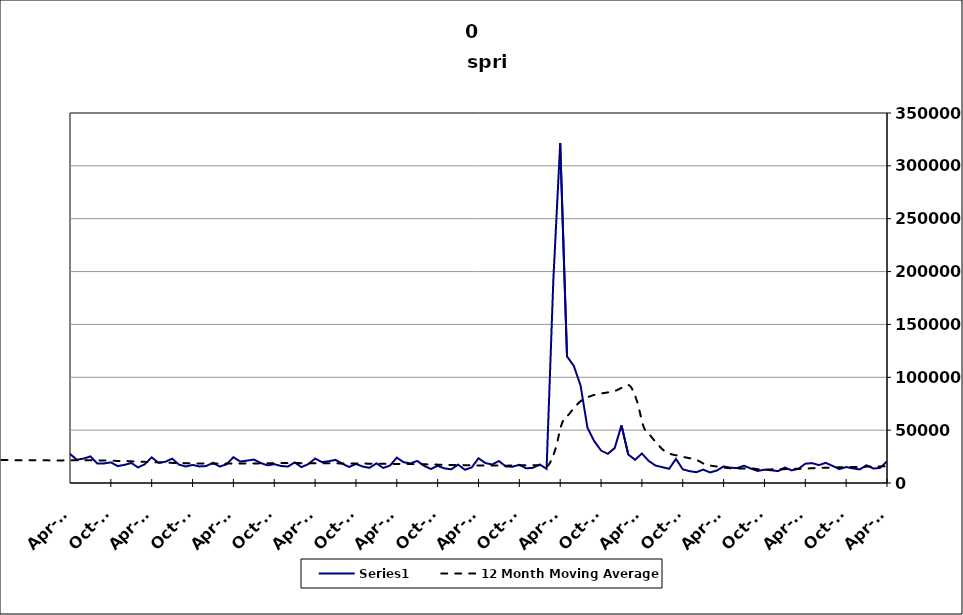
| Category | Series 0 |
|---|---|
| 2005-06-30 | 15559 |
| 2005-07-31 | 18863 |
| 2005-08-31 | 13688 |
| 2005-09-30 | 11216 |
| 2005-10-31 | 15195 |
| 2005-11-30 | 11106 |
| 2005-12-31 | 12178 |
| 2006-01-31 | 12307 |
| 2006-02-28 | 9756 |
| 2006-03-31 | 11166 |
| 2006-04-30 | 18194 |
| 2006-05-31 | 13863 |
| 2006-06-30 | 14337 |
| 2006-07-31 | 17845 |
| 2006-08-31 | 13259 |
| 2006-09-30 | 13170 |
| 2006-10-31 | 14318 |
| 2006-11-30 | 12528 |
| 2006-12-31 | 14662 |
| 2007-01-31 | 14365 |
| 2007-02-28 | 12004 |
| 2007-03-31 | 15715 |
| 2007-04-30 | 21487 |
| 2007-05-31 | 15927 |
| 2007-06-30 | 20117 |
| 2007-07-30 | 19634 |
| 2007-08-31 | 15908 |
| 2007-09-30 | 17289 |
| 2007-10-31 | 17016 |
| 2007-11-15 | 14868 |
| 2007-12-15 09:36:00 | 15051 |
| 2008-01-14 19:12:00 | 19519 |
| 2008-02-14 04:48:00 | 17071 |
| 2008-03-15 14:24:00 | 18041 |
| 2008-04-15 | 26337 |
| 2008-05-15 09:36:00 | 21529 |
| 2008-06-14 19:12:00 | 24509 |
| 2008-07-15 04:48:00 | 26739 |
| 2008-08-14 14:24:00 | 22508 |
| 2008-09-14 | 24197 |
| 2008-10-14 09:36:00 | 30666 |
| 2008-11-13 19:12:00 | 30363 |
| 2008-12-14 04:48:00 | 34409 |
| 2009-01-13 14:24:00 | 39076 |
| 2009-02-13 | 34958 |
| 2009-03-15 09:36:00 | 39174 |
| 2009-04-14 19:12:00 | 41068 |
| 2009-05-15 04:48:00 | 34839 |
| 2009-06-14 14:24:00 | 38758 |
| 2009-07-15 | 38827 |
| 2009-08-14 09:36:00 | 32747 |
| 2009-09-13 19:12:00 | 30654 |
| 2009-10-14 04:48:00 | 31279 |
| 2009-11-13 14:24:00 | 28764 |
| 2009-12-14 | 28567 |
| 2010-01-13 09:36:00 | 31536 |
| 2010-02-12 19:12:00 | 23411 |
| 2010-03-15 04:48:00 | 27064 |
| 2010-04-14 14:24:00 | 31806 |
| 2010-05-15 | 27535 |
| 2010-06-14 09:36:00 | 30999 |
| 2010-07-14 19:12:00 | 30859 |
| 2010-08-14 04:48:00 | 27473 |
| 2010-09-13 14:24:00 | 23569 |
| 2010-10-14 | 26397 |
| 2010-11-13 09:36:00 | 23332 |
| 2010-12-13 19:12:00 | 23208 |
| 2011-01-13 04:48:00 | 29123 |
| 2011-02-12 14:24:00 | 19880 |
| 2011-03-15 | 23037 |
| 2011-04-14 09:36:00 | 29838 |
| 2011-05-14 19:12:00 | 26805 |
| 2011-06-14 04:48:00 | 27951 |
| 2011-07-14 14:24:00 | 27959 |
| 2011-08-14 | 25368 |
| 2011-09-13 09:36:00 | 21516 |
| 2011-10-13 19:12:00 | 25249 |
| 2011-11-13 04:48:00 | 21348 |
| 2011-12-13 14:24:00 | 21373 |
| 2012-01-13 | 26870 |
| 2012-02-12 09:36:00 | 19799 |
| 2012-03-13 19:12:00 | 20523 |
| 2012-04-13 04:48:00 | 29208 |
| 2012-05-13 14:24:00 | 25322 |
| 2012-06-13 | 23562 |
| 2012-07-13 09:36:00 | 27564 |
| 2012-08-12 19:12:00 | 21787 |
| 2012-09-12 04:48:00 | 18024 |
| 2012-10-12 14:24:00 | 22967 |
| 2012-11-12 | 19147 |
| 2012-12-12 09:36:00 | 18332 |
| 2013-01-11 19:12:00 | 24929 |
| 2013-02-11 04:48:00 | 17864 |
| 2013-03-13 14:24:00 | 18518 |
| 2013-04-13 | 27564 |
| 2013-05-13 09:36:00 | 22544 |
| 2013-06-12 19:12:00 | 22178 |
| 2013-07-13 04:48:00 | 25052 |
| 2013-08-12 14:24:00 | 20510 |
| 2013-09-12 | 18652 |
| 2013-10-12 09:36:00 | 23457 |
| 2013-11-11 19:12:00 | 17762 |
| 2013-12-12 04:48:00 | 18554 |
| 2014-01-11 14:24:00 | 23110 |
| 2014-02-11 | 17656 |
| 2014-03-13 09:36:00 | 20574 |
| 2014-04-12 19:12:00 | 27528 |
| 2014-05-13 04:48:00 | 22003 |
| 2014-06-12 14:24:00 | 23093 |
| 2014-07-13 | 25159 |
| 2014-08-12 09:36:00 | 18501 |
| 2014-09-11 19:12:00 | 18519 |
| 2014-10-12 04:48:00 | 19501 |
| 2014-11-11 14:24:00 | 16036 |
| 2014-12-12 | 17142 |
| 2015-01-11 09:36:00 | 18920 |
| 2015-02-10 19:12:00 | 14673 |
| 2015-03-13 04:48:00 | 17842 |
| 2015-04-12 14:24:00 | 24284 |
| 2015-05-13 | 19120 |
| 2015-06-12 09:36:00 | 20073 |
| 2015-07-12 19:12:00 | 23007 |
| 2015-08-12 04:48:00 | 17420 |
| 2015-09-11 14:24:00 | 15620 |
| 2015-10-12 | 17117 |
| 2015-11-11 09:36:00 | 15685 |
| 2015-12-11 19:12:00 | 16020 |
| 2016-01-11 04:48:00 | 19143 |
| 2016-02-10 14:24:00 | 15551 |
| 2016-03-12 | 17721 |
| 2016-04-11 09:36:00 | 24381 |
| 2016-05-11 19:12:00 | 20319 |
| 2016-06-11 04:48:00 | 21157 |
| 2016-07-11 14:24:00 | 22155 |
| 2016-08-11 | 18945 |
| 2016-09-10 09:36:00 | 16699 |
| 2016-10-10 19:12:00 | 17773 |
| 2016-11-10 04:48:00 | 16104 |
| 2016-12-10 14:24:00 | 15555 |
| 2017-01-10 | 19468 |
| 2017-02-09 09:36:00 | 15031 |
| 2017-03-11 19:12:00 | 17840 |
| 2017-04-11 04:48:00 | 23124 |
| 2017-05-11 14:24:00 | 19802 |
| 2017-06-11 | 20588 |
| 2017-07-11 09:36:00 | 21858 |
| 2017-08-10 19:12:00 | 18231 |
| 2017-09-10 04:48:00 | 15171 |
| 2017-10-10 14:24:00 | 18027 |
| 2017-11-10 | 15538 |
| 2017-12-10 09:36:00 | 14339 |
| 2018-01-09 19:12:00 | 18538 |
| 2018-02-09 04:48:00 | 14230 |
| 2018-03-11 14:24:00 | 16525 |
| 2018-04-11 | 23962 |
| 2018-05-11 09:36:00 | 19679 |
| 2018-06-10 19:12:00 | 18492 |
| 2018-07-11 04:48:00 | 20879 |
| 2018-08-10 14:24:00 | 16306 |
| 2018-09-10 | 13227 |
| 2018-10-10 09:36:00 | 16273 |
| 2018-11-09 19:12:00 | 13796 |
| 2018-12-10 04:48:00 | 12964 |
| 2019-01-09 14:24:00 | 17391 |
| 2019-02-09 | 12534 |
| 2019-03-11 09:36:00 | 14705 |
| 2019-04-10 19:12:00 | 23399 |
| 2019-05-11 04:48:00 | 18895 |
| 2019-06-10 14:24:00 | 17486 |
| 2019-07-11 | 20792 |
| 2019-08-10 09:36:00 | 15676 |
| 2019-09-09 19:12:00 | 15415 |
| 2019-10-10 04:48:00 | 17202 |
| 2019-11-09 14:24:00 | 13905 |
| 2019-12-10 | 14356 |
| 2020-01-09 09:36:00 | 17551 |
| 2020-02-08 19:12:00 | 13374 |
| 2020-03-10 04:48:00 | 193236 |
| 2020-04-09 14:24:00 | 321397 |
| 2020-05-10 | 119809 |
| 2020-06-09 09:36:00 | 110709 |
| 2020-07-09 19:12:00 | 91992 |
| 2020-08-09 04:48:00 | 52303 |
| 2020-09-08 14:24:00 | 39616 |
| 2020-10-09 | 30687 |
| 2020-11-08 09:36:00 | 27606 |
| 2020-12-08 19:12:00 | 32990 |
| 2021-01-08 04:48:00 | 54483 |
| 2021-02-07 14:24:00 | 26952 |
| 2021-03-10 | 21951 |
| 2021-04-09 09:36:00 | 27881 |
| 2021-05-09 19:12:00 | 20877 |
| 2021-06-09 04:48:00 | 16503 |
| 2021-07-09 14:24:00 | 14975 |
| 2021-08-09 | 13409 |
| 2021-09-08 09:36:00 | 22784 |
| 2021-10-08 19:12:00 | 12970 |
| 2021-11-08 04:48:00 | 11178 |
| 2021-12-08 14:24:00 | 10213 |
| 2022-01-08 | 12675 |
| 2022-02-07 09:36:00 | 10001 |
| 2022-03-09 19:12:00 | 11739 |
| 2022-04-09 04:48:00 | 15679 |
| 2022-05-09 14:24:00 | 14464 |
| 2022-06-09 | 14143 |
| 2022-07-09 09:36:00 | 16322 |
| 2022-08-08 19:12:00 | 13673 |
| 2022-09-08 04:48:00 | 11418 |
| 2022-10-08 14:24:00 | 12593 |
| 2022-11-08 | 12027 |
| 2022-12-08 09:36:00 | 11247 |
| 2023-01-07 19:12:00 | 14638 |
| 2023-02-07 04:48:00 | 11960 |
| 2023-03-09 14:24:00 | 13385 |
| 2023-04-09 | 18262 |
| 2023-05-09 09:36:00 | 18799 |
| 2023-06-08 19:12:00 | 16928 |
| 2023-07-09 04:48:00 | 19035 |
| 2023-08-08 14:24:00 | 16202 |
| 2023-09-08 | 13123 |
| 2023-10-08 09:36:00 | 15075 |
| 2023-11-07 19:12:00 | 13832 |
| 2023-12-08 04:48:00 | 12849 |
| 2024-01-07 14:24:00 | 16797 |
| 2024-02-07 | 13632 |
| 2024-03-08 09:36:00 | 14351 |
| 2024-04-07 19:12:00 | 20403 |